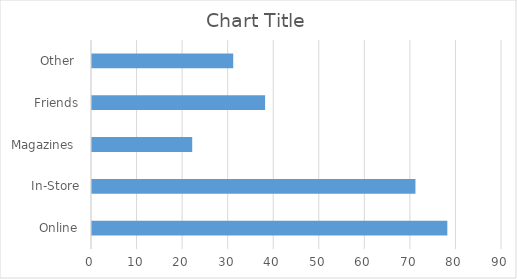
| Category | Series 0 |
|---|---|
| Online | 78 |
| In-Store | 71 |
| Magazines  | 22 |
| Friends | 38 |
| Other  | 31 |